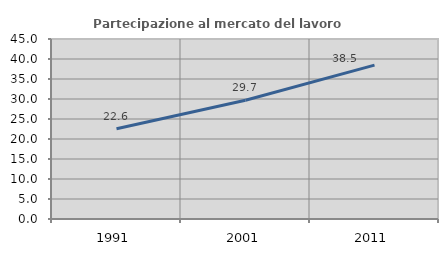
| Category | Partecipazione al mercato del lavoro  femminile |
|---|---|
| 1991.0 | 22.564 |
| 2001.0 | 29.701 |
| 2011.0 | 38.475 |